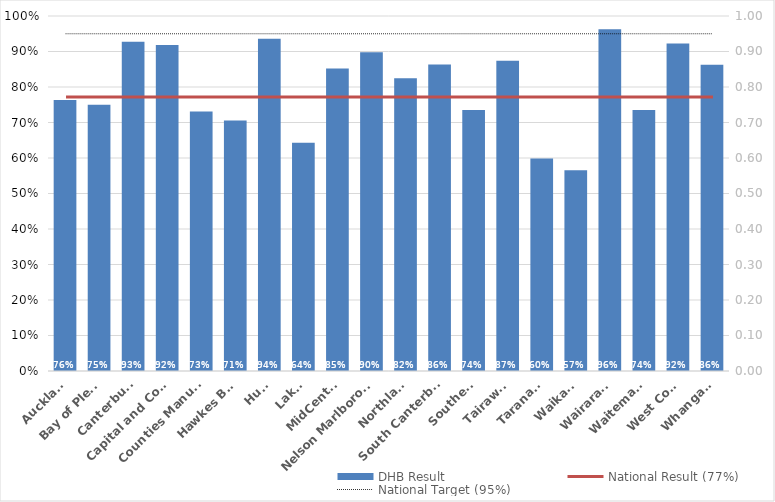
| Category | DHB Result |
|---|---|
| Auckland | 0.763 |
| Bay of Plenty | 0.75 |
| Canterbury | 0.927 |
| Capital and Coast | 0.918 |
| Counties Manukau | 0.731 |
| Hawkes Bay | 0.706 |
| Hutt | 0.936 |
| Lakes | 0.643 |
| MidCentral | 0.852 |
| Nelson Marlborough | 0.898 |
| Northland | 0.825 |
| South Canterbury | 0.863 |
| Southern | 0.735 |
| Tairawhiti | 0.874 |
| Taranaki | 0.598 |
| Waikato | 0.565 |
| Wairarapa | 0.963 |
| Waitemata | 0.735 |
| West Coast | 0.922 |
| Whanganui | 0.863 |